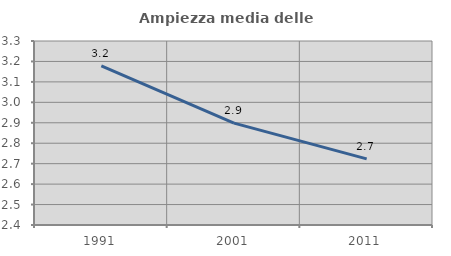
| Category | Ampiezza media delle famiglie |
|---|---|
| 1991.0 | 3.178 |
| 2001.0 | 2.898 |
| 2011.0 | 2.723 |